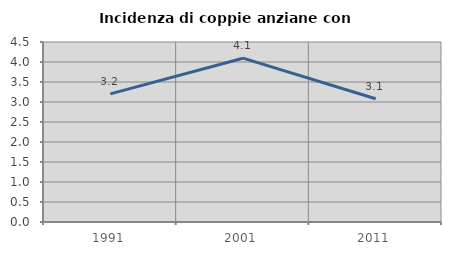
| Category | Incidenza di coppie anziane con figli |
|---|---|
| 1991.0 | 3.203 |
| 2001.0 | 4.096 |
| 2011.0 | 3.081 |